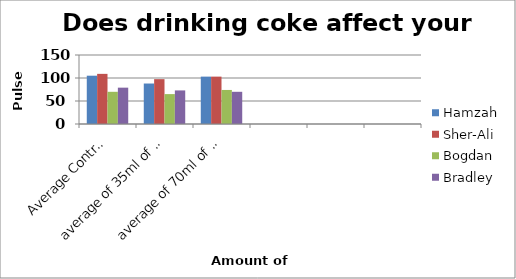
| Category | Hamzah | Sher-Ali | Bogdan | Bradley |
|---|---|---|---|---|
| Average Control | 105 | 109 | 70 | 79 |
| average of 35ml of coke  | 88 | 97.5 | 65 | 73 |
| average of 70ml of coke  | 103 | 103 | 74 | 70 |